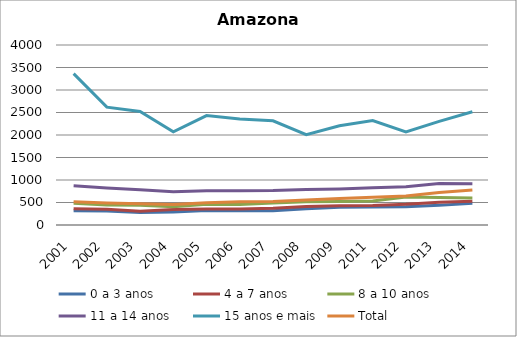
| Category | 0 a 3 anos | 4 a 7 anos | 8 a 10 anos | 11 a 14 anos | 15 anos e mais | Total |
|---|---|---|---|---|---|---|
| 2001.0 | 316 | 360.1 | 481 | 871.2 | 3364.6 | 519.2 |
| 2002.0 | 313.4 | 350.3 | 442.8 | 823.4 | 2619.7 | 489 |
| 2003.0 | 276.1 | 308 | 438.9 | 781 | 2524 | 470.1 |
| 2004.0 | 290.2 | 346.9 | 404.1 | 737.2 | 2072.6 | 457.7 |
| 2005.0 | 319.7 | 354 | 460.6 | 763.4 | 2430.6 | 494.8 |
| 2006.0 | 316.2 | 358.1 | 453.2 | 760.2 | 2354.9 | 516.6 |
| 2007.0 | 314.5 | 369.8 | 487.8 | 765.6 | 2316.3 | 521.4 |
| 2008.0 | 362.8 | 412.1 | 518.4 | 788.3 | 2006.7 | 557 |
| 2009.0 | 394.8 | 426.3 | 524.3 | 802 | 2207 | 586.4 |
| 2011.0 | 401 | 433.8 | 534.8 | 828.6 | 2319.1 | 617 |
| 2012.0 | 408 | 459.2 | 619.5 | 848.9 | 2065.9 | 642.9 |
| 2013.0 | 437.4 | 507.6 | 612.9 | 922.2 | 2301.7 | 723.8 |
| 2014.0 | 480.5 | 525.1 | 598.7 | 916.9 | 2516 | 775.5 |